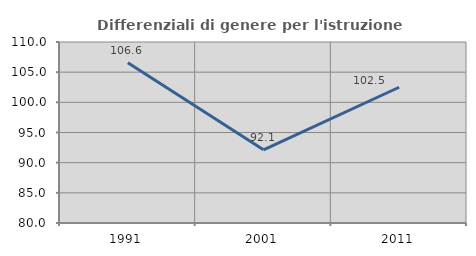
| Category | Differenziali di genere per l'istruzione superiore |
|---|---|
| 1991.0 | 106.568 |
| 2001.0 | 92.124 |
| 2011.0 | 102.499 |